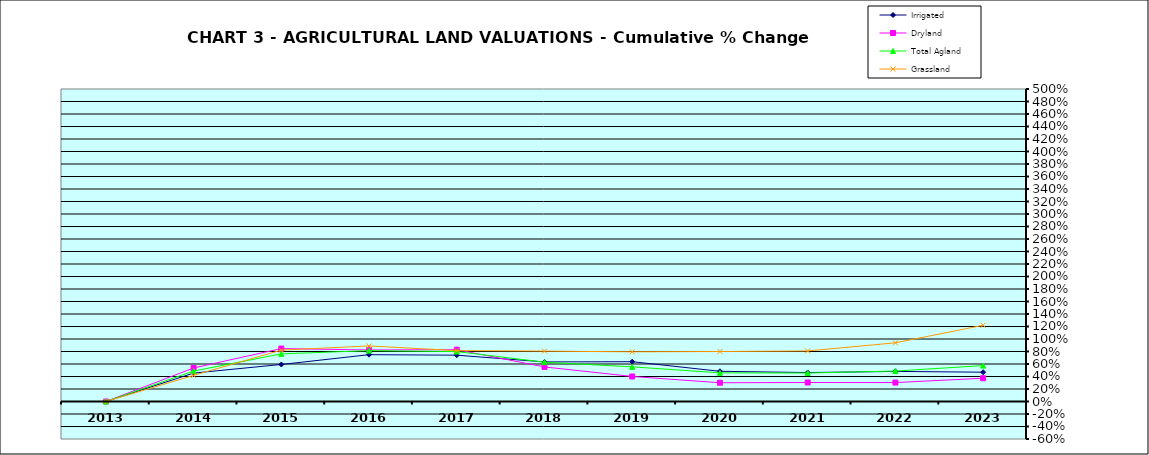
| Category | Irrigated | Dryland | Total Agland | Grassland |
|---|---|---|---|---|
| 2013.0 | 0 | 0 | 0 | 0 |
| 2014.0 | 0.455 | 0.536 | 0.487 | 0.418 |
| 2015.0 | 0.592 | 0.847 | 0.762 | 0.822 |
| 2016.0 | 0.749 | 0.824 | 0.814 | 0.889 |
| 2017.0 | 0.741 | 0.829 | 0.799 | 0.814 |
| 2018.0 | 0.633 | 0.553 | 0.629 | 0.806 |
| 2019.0 | 0.637 | 0.4 | 0.554 | 0.795 |
| 2020.0 | 0.483 | 0.3 | 0.459 | 0.8 |
| 2021.0 | 0.463 | 0.304 | 0.456 | 0.809 |
| 2022.0 | 0.481 | 0.303 | 0.487 | 0.939 |
| 2023.0 | 0.469 | 0.373 | 0.574 | 1.22 |